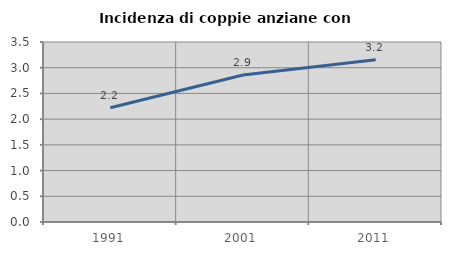
| Category | Incidenza di coppie anziane con figli |
|---|---|
| 1991.0 | 2.222 |
| 2001.0 | 2.857 |
| 2011.0 | 3.155 |